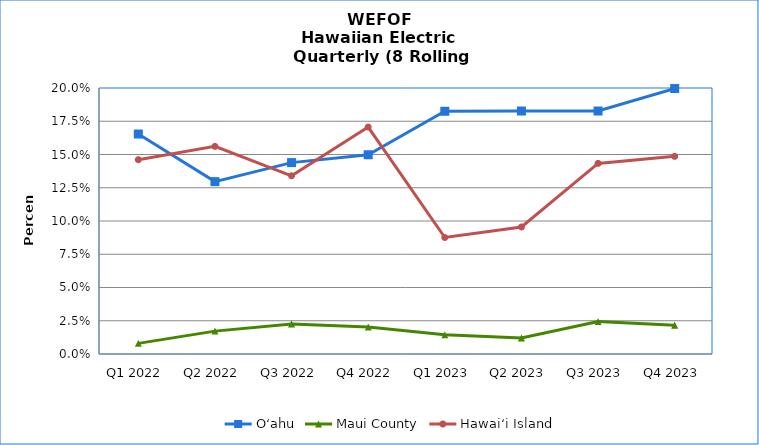
| Category | O‘ahu | Maui County | Hawai‘i Island |
|---|---|---|---|
| Q1 2022 | 0.165 | 0.008 | 0.146 |
| Q2 2022 | 0.13 | 0.017 | 0.156 |
| Q3 2022 | 0.144 | 0.023 | 0.134 |
| Q4 2022 | 0.15 | 0.02 | 0.171 |
| Q1 2023 | 0.182 | 0.014 | 0.088 |
| Q2 2023 | 0.183 | 0.012 | 0.096 |
| Q3 2023 | 0.183 | 0.024 | 0.143 |
| Q4 2023 | 0.2 | 0.022 | 0.149 |